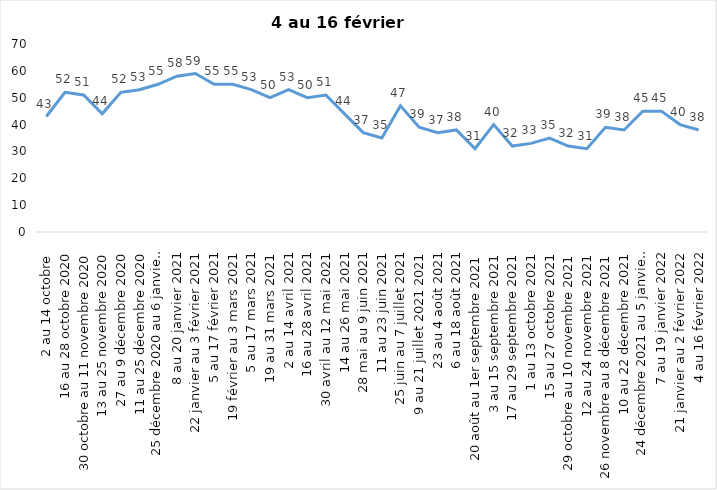
| Category | Toujours aux trois mesures |
|---|---|
| 2 au 14 octobre  | 43 |
| 16 au 28 octobre 2020 | 52 |
| 30 octobre au 11 novembre 2020 | 51 |
| 13 au 25 novembre 2020 | 44 |
| 27 au 9 décembre 2020 | 52 |
| 11 au 25 décembre 2020 | 53 |
| 25 décembre 2020 au 6 janvier 2021 | 55 |
| 8 au 20 janvier 2021 | 58 |
| 22 janvier au 3 février 2021 | 59 |
| 5 au 17 février 2021 | 55 |
| 19 février au 3 mars 2021 | 55 |
| 5 au 17 mars 2021 | 53 |
| 19 au 31 mars 2021 | 50 |
| 2 au 14 avril 2021 | 53 |
| 16 au 28 avril 2021 | 50 |
| 30 avril au 12 mai 2021 | 51 |
| 14 au 26 mai 2021 | 44 |
| 28 mai au 9 juin 2021 | 37 |
| 11 au 23 juin 2021 | 35 |
| 25 juin au 7 juillet 2021 | 47 |
| 9 au 21 juillet 2021 2021 | 39 |
| 23 au 4 août 2021 | 37 |
| 6 au 18 août 2021 | 38 |
| 20 août au 1er septembre 2021 | 31 |
| 3 au 15 septembre 2021 | 40 |
| 17 au 29 septembre 2021 | 32 |
| 1 au 13 octobre 2021 | 33 |
| 15 au 27 octobre 2021 | 35 |
| 29 octobre au 10 novembre 2021 | 32 |
| 12 au 24 novembre 2021 | 31 |
| 26 novembre au 8 décembre 2021 | 39 |
| 10 au 22 décembre 2021 | 38 |
| 24 décembre 2021 au 5 janvier 2022 2022 | 45 |
| 7 au 19 janvier 2022 | 45 |
| 21 janvier au 2 février 2022 | 40 |
| 4 au 16 février 2022 | 38 |